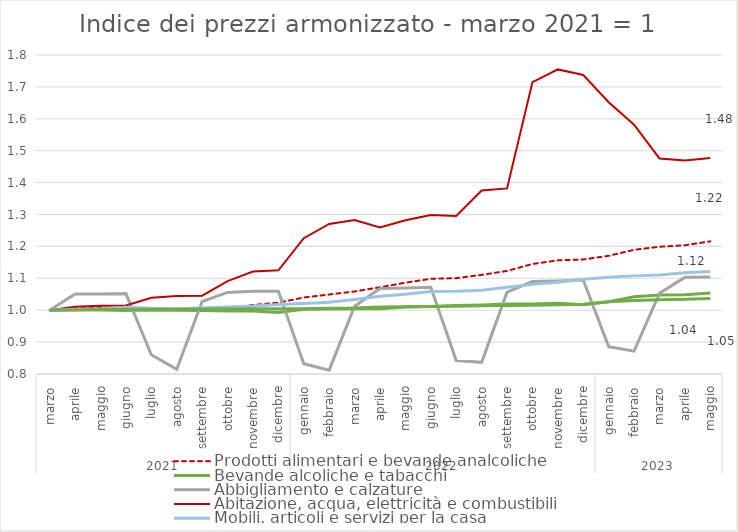
| Category | Prodotti alimentari e bevande analcoliche | Bevande alcoliche e tabacchi | Abbigliamento e calzature | Abitazione, acqua, elettricità e combustibili | Mobili, articoli e servizi per la casa | Servizi sanitari e spese per la salute |
|---|---|---|---|---|---|---|
| 0 | 1 | 1 | 1 | 1 | 1 | 1 |
| 1 | 1.007 | 1.002 | 1.051 | 1.011 | 1.003 | 1.001 |
| 2 | 1.009 | 1.001 | 1.051 | 1.014 | 1.005 | 1.002 |
| 3 | 1.006 | 0.999 | 1.052 | 1.015 | 1.009 | 1.003 |
| 4 | 1 | 1.001 | 0.86 | 1.039 | 1.006 | 1.003 |
| 5 | 1.004 | 1 | 0.815 | 1.045 | 1.005 | 1.003 |
| 6 | 1.005 | 0.999 | 1.027 | 1.046 | 1.007 | 1.004 |
| 7 | 1.008 | 0.997 | 1.056 | 1.091 | 1.01 | 1.004 |
| 8 | 1.016 | 0.997 | 1.059 | 1.121 | 1.013 | 1.005 |
| 9 | 1.024 | 0.993 | 1.059 | 1.125 | 1.018 | 1.005 |
| 10 | 1.04 | 1.003 | 0.832 | 1.226 | 1.021 | 1.005 |
| 11 | 1.049 | 1.004 | 0.812 | 1.27 | 1.025 | 1.006 |
| 12 | 1.059 | 1.005 | 1.012 | 1.283 | 1.034 | 1.007 |
| 13 | 1.072 | 1.005 | 1.068 | 1.26 | 1.043 | 1.01 |
| 14 | 1.086 | 1.01 | 1.07 | 1.282 | 1.05 | 1.011 |
| 15 | 1.098 | 1.012 | 1.072 | 1.298 | 1.058 | 1.012 |
| 16 | 1.1 | 1.015 | 0.842 | 1.296 | 1.059 | 1.013 |
| 17 | 1.111 | 1.016 | 0.837 | 1.375 | 1.062 | 1.014 |
| 18 | 1.123 | 1.019 | 1.057 | 1.382 | 1.072 | 1.015 |
| 19 | 1.145 | 1.019 | 1.09 | 1.715 | 1.081 | 1.016 |
| 20 | 1.156 | 1.022 | 1.092 | 1.755 | 1.088 | 1.017 |
| 21 | 1.159 | 1.017 | 1.094 | 1.737 | 1.097 | 1.018 |
| 22 | 1.17 | 1.026 | 0.886 | 1.652 | 1.104 | 1.026 |
| 23 | 1.189 | 1.042 | 0.872 | 1.581 | 1.108 | 1.03 |
| 24 | 1.199 | 1.047 | 1.053 | 1.476 | 1.111 | 1.033 |
| 25 | 1.204 | 1.048 | 1.103 | 1.469 | 1.117 | 1.034 |
| 26 | 1.216 | 1.054 | 1.104 | 1.477 | 1.121 | 1.037 |